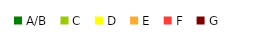
| Category | "data" for legend - do not delete |
|---|---|
| A/B | 0 |
| C | 0 |
| D | 0 |
| E | 0 |
| F | 0 |
| G | 0 |